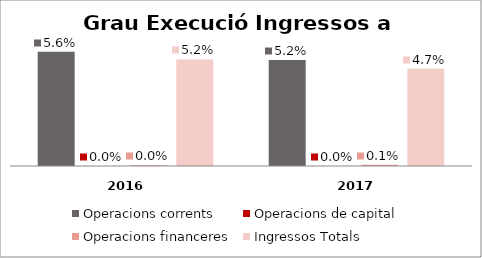
| Category | Operacions corrents | Operacions de capital | Operacions financeres | Ingressos Totals |
|---|---|---|---|---|
| 0 | 0.056 | 0 | 0 | 0.052 |
| 1 | 0.052 | 0 | 0.001 | 0.047 |